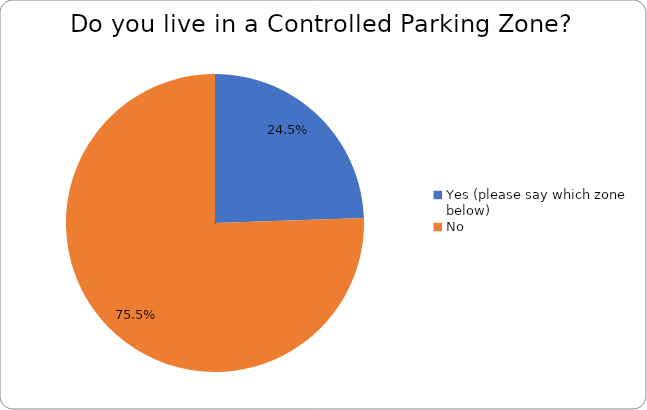
| Category | Series 0 |
|---|---|
| Yes (please say which zone below) | 0.245 |
| No | 0.755 |